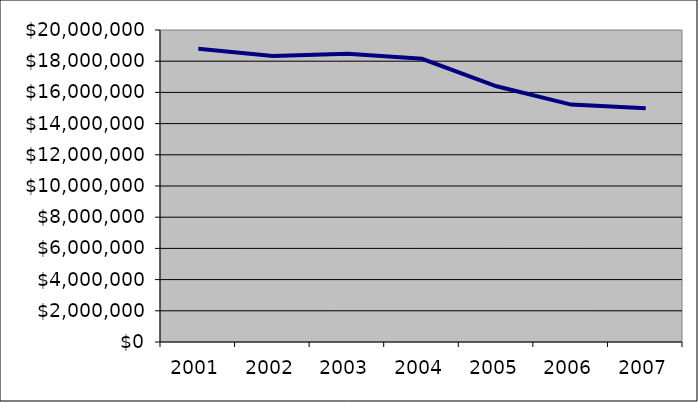
| Category | Aggregate Distribution Depreciation |
|---|---|
| 2001.0 | 18803355.73 |
| 2002.0 | 18334809.032 |
| 2003.0 | 18482653.543 |
| 2004.0 | 18151867.435 |
| 2005.0 | 16390580.83 |
| 2006.0 | 15216754.037 |
| 2007.0 | 14987162.28 |